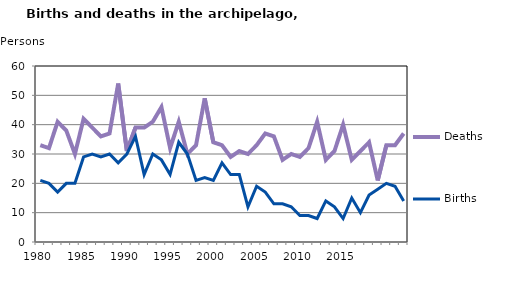
| Category | Deaths | Births |
|---|---|---|
| 1980.0 | 33 | 21 |
| 1981.0 | 32 | 20 |
| 1982.0 | 41 | 17 |
| 1983.0 | 38 | 20 |
| 1984.0 | 30 | 20 |
| 1985.0 | 42 | 29 |
| 1986.0 | 39 | 30 |
| 1987.0 | 36 | 29 |
| 1988.0 | 37 | 30 |
| 1989.0 | 54 | 27 |
| 1990.0 | 31 | 30 |
| 1991.0 | 39 | 36 |
| 1992.0 | 39 | 23 |
| 1993.0 | 41 | 30 |
| 1994.0 | 46 | 28 |
| 1995.0 | 32 | 23 |
| 1996.0 | 41 | 34 |
| 1997.0 | 30 | 30 |
| 1998.0 | 33 | 21 |
| 1999.0 | 49 | 22 |
| 2000.0 | 34 | 21 |
| 2001.0 | 33 | 27 |
| 2002.0 | 29 | 23 |
| 2003.0 | 31 | 23 |
| 2004.0 | 30 | 12 |
| 2005.0 | 33 | 19 |
| 2006.0 | 37 | 17 |
| 2007.0 | 36 | 13 |
| 2008.0 | 28 | 13 |
| 2009.0 | 30 | 12 |
| 2010.0 | 29 | 9 |
| 2011.0 | 32 | 9 |
| 2012.0 | 41 | 8 |
| 2013.0 | 28 | 14 |
| 2014.0 | 31 | 12 |
| 2015.0 | 40 | 8 |
| 2016.0 | 28 | 15 |